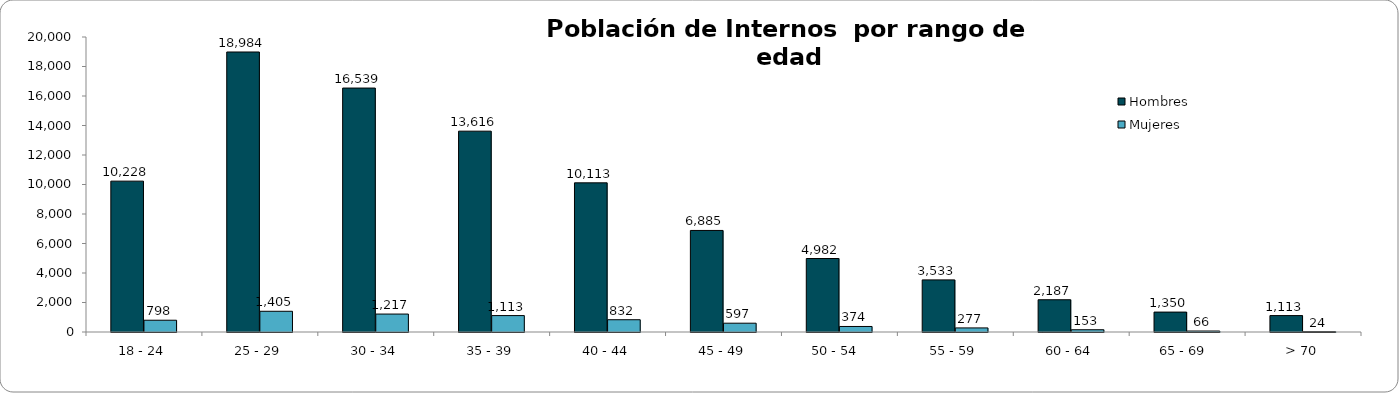
| Category | Hombres | Mujeres |
|---|---|---|
| 18 - 24 | 10228 | 798 |
| 25 - 29 | 18984 | 1405 |
| 30 - 34 | 16539 | 1217 |
| 35 - 39 | 13616 | 1113 |
| 40 - 44 | 10113 | 832 |
| 45 - 49 | 6885 | 597 |
| 50 - 54  | 4982 | 374 |
| 55 - 59 | 3533 | 277 |
| 60 - 64 | 2187 | 153 |
| 65 - 69  | 1350 | 66 |
| > 70 | 1113 | 24 |